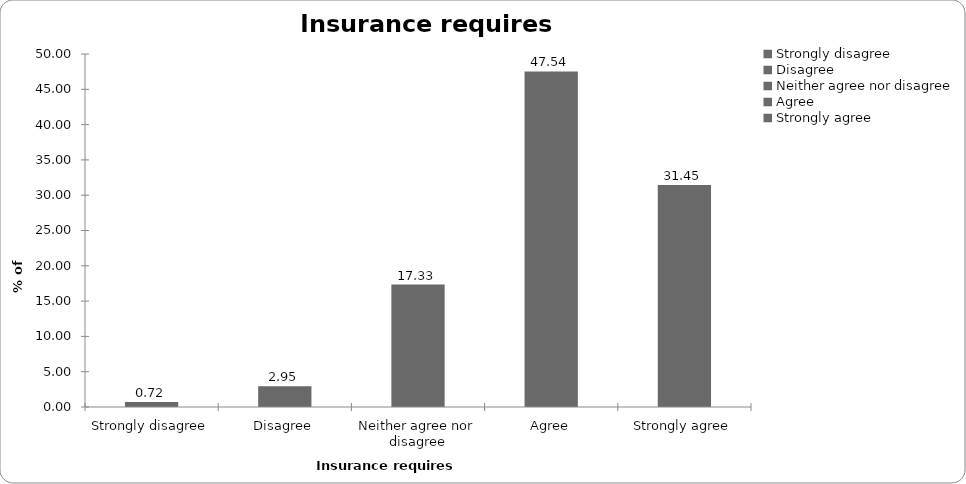
| Category | Insurance requires regulation |
|---|---|
| Strongly disagree | 0.722 |
| Disagree | 2.955 |
| Neither agree nor disagree | 17.334 |
| Agree | 47.538 |
| Strongly agree | 31.451 |